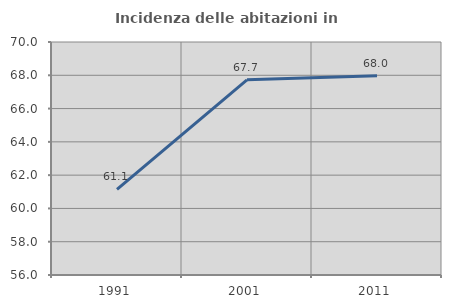
| Category | Incidenza delle abitazioni in proprietà  |
|---|---|
| 1991.0 | 61.144 |
| 2001.0 | 67.727 |
| 2011.0 | 67.972 |